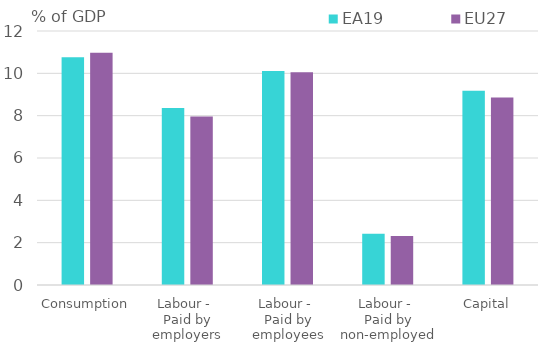
| Category | EA19 | EU27 |
|---|---|---|
| Consumption | 10.761 | 10.967 |
| Labour - 
Paid by employers | 8.36 | 7.966 |
| Labour - 
Paid by employees | 10.113 | 10.052 |
| Labour - 
Paid by non-employed | 2.42 | 2.311 |
| Capital | 9.18 | 8.858 |